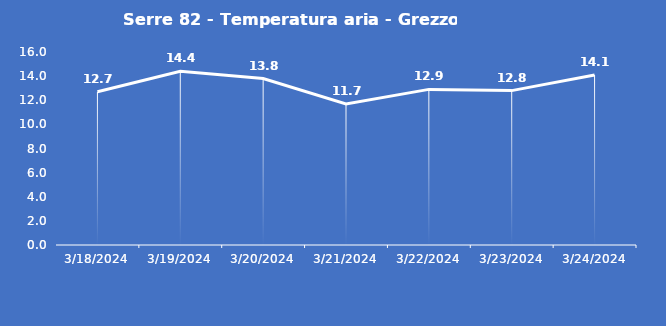
| Category | Serre 82 - Temperatura aria - Grezzo (°C) |
|---|---|
| 3/18/24 | 12.7 |
| 3/19/24 | 14.4 |
| 3/20/24 | 13.8 |
| 3/21/24 | 11.7 |
| 3/22/24 | 12.9 |
| 3/23/24 | 12.8 |
| 3/24/24 | 14.1 |